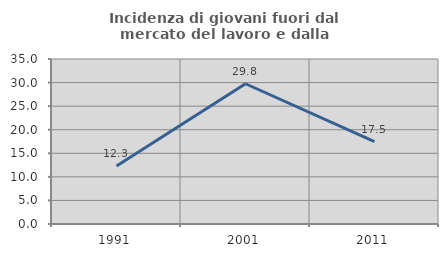
| Category | Incidenza di giovani fuori dal mercato del lavoro e dalla formazione  |
|---|---|
| 1991.0 | 12.314 |
| 2001.0 | 29.75 |
| 2011.0 | 17.485 |